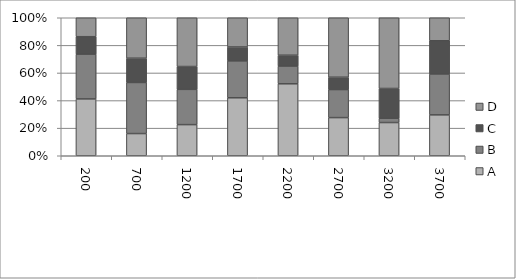
| Category | A | B | C | D |
|---|---|---|---|---|
| 200.0 | 0.412 | 0.325 | 0.126 | 0.137 |
| 700.0 | 0.161 | 0.37 | 0.176 | 0.293 |
| 1200.0 | 0.226 | 0.256 | 0.165 | 0.353 |
| 1700.0 | 0.42 | 0.267 | 0.101 | 0.212 |
| 2200.0 | 0.521 | 0.129 | 0.079 | 0.271 |
| 2700.0 | 0.276 | 0.203 | 0.089 | 0.431 |
| 3200.0 | 0.241 | 0.031 | 0.216 | 0.512 |
| 3700.0 | 0.296 | 0.296 | 0.241 | 0.167 |